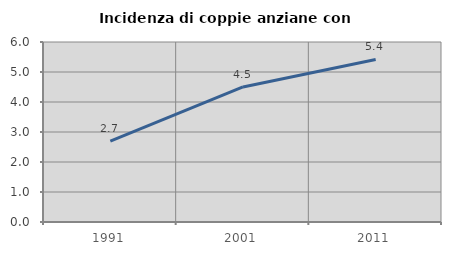
| Category | Incidenza di coppie anziane con figli |
|---|---|
| 1991.0 | 2.698 |
| 2001.0 | 4.503 |
| 2011.0 | 5.418 |